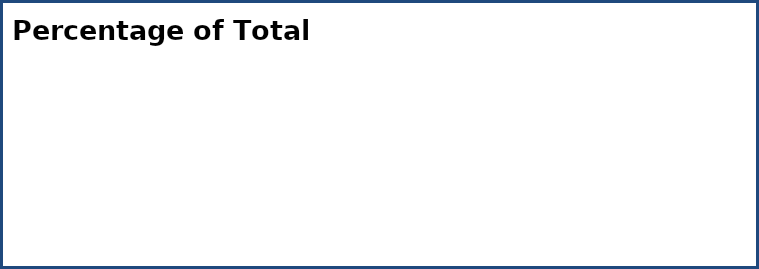
| Category | Series 0 |
|---|---|
| Strengths | 0 |
| Mild | 0 |
| Moderate | 0 |
| Significant | 0 |